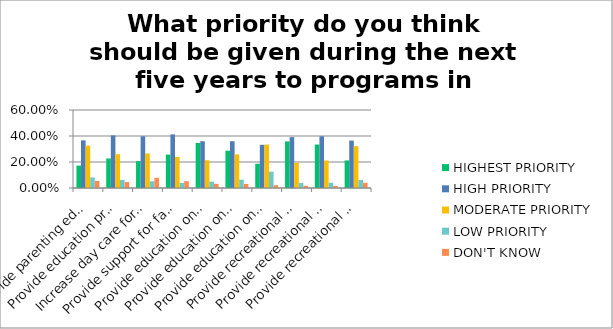
| Category | HIGHEST PRIORITY | HIGH PRIORITY | MODERATE PRIORITY | LOW PRIORITY | DON'T KNOW |
|---|---|---|---|---|---|
| Provide parenting education? | 0.172 | 0.366 | 0.326 | 0.081 | 0.054 |
| Provide education programs for teen parents? | 0.227 | 0.405 | 0.26 | 0.062 | 0.046 |
| Increase day care for the elderly? | 0.207 | 0.398 | 0.266 | 0.052 | 0.078 |
| Provide support for family caregivers for the elderly? | 0.257 | 0.412 | 0.24 | 0.039 | 0.052 |
| Provide education on suicide prevention in the schools? | 0.346 | 0.36 | 0.213 | 0.049 | 0.032 |
| Provide education on suicide prevention in the community? | 0.287 | 0.36 | 0.258 | 0.064 | 0.031 |
| Provide education on how to prepare for community emergencies and disasters? | 0.186 | 0.332 | 0.334 | 0.126 | 0.022 |
| Provide recreational activities for youth? | 0.359 | 0.391 | 0.194 | 0.039 | 0.017 |
| Provide recreational activities for families? | 0.334 | 0.398 | 0.211 | 0.04 | 0.016 |
| Provide recreational activities for the elderly? | 0.212 | 0.365 | 0.322 | 0.062 | 0.04 |